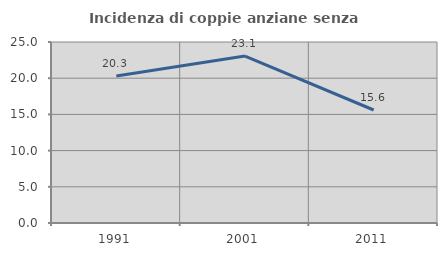
| Category | Incidenza di coppie anziane senza figli  |
|---|---|
| 1991.0 | 20.308 |
| 2001.0 | 23.059 |
| 2011.0 | 15.608 |